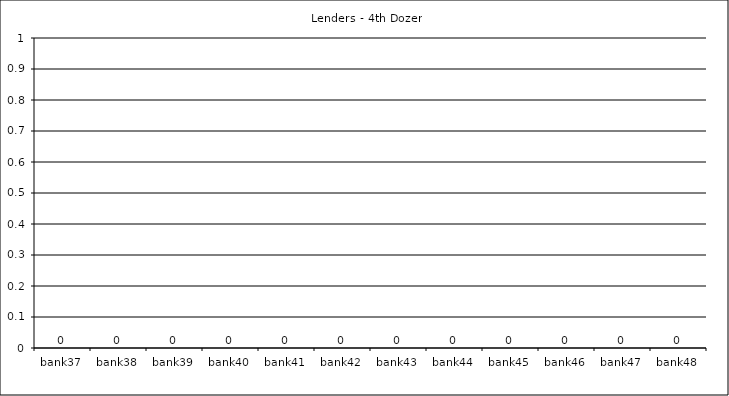
| Category | Lenders - 3rd Dozen |
|---|---|
| bank37 | 0 |
| bank38 | 0 |
| bank39 | 0 |
| bank40 | 0 |
| bank41 | 0 |
| bank42 | 0 |
| bank43 | 0 |
| bank44 | 0 |
| bank45 | 0 |
| bank46 | 0 |
| bank47 | 0 |
| bank48 | 0 |